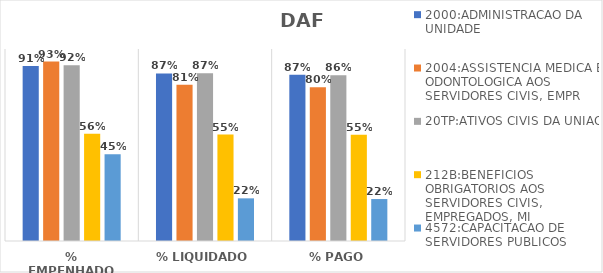
| Category | 2000:ADMINISTRACAO DA UNIDADE | 2004:ASSISTENCIA MEDICA E ODONTOLOGICA AOS SERVIDORES CIVIS, EMPR | 20TP:ATIVOS CIVIS DA UNIAO | 212B:BENEFICIOS OBRIGATORIOS AOS SERVIDORES CIVIS, EMPREGADOS, MI | 4572:CAPACITACAO DE SERVIDORES PUBLICOS FEDERAIS EM PROCESSO DE Q |
|---|---|---|---|---|---|
| % EMPENHADO | 0.911 | 0.935 | 0.915 | 0.558 | 0.452 |
| % LIQUIDADO | 0.873 | 0.814 | 0.874 | 0.555 | 0.222 |
| % PAGO | 0.866 | 0.8 | 0.864 | 0.554 | 0.219 |